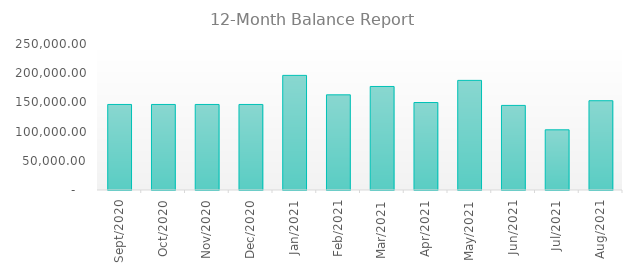
| Category | Value |
|---|---|
| 2020-09-30 | 146475 |
| 2020-10-31 | 146475 |
| 2020-11-30 | 146475 |
| 2020-12-31 | 146475 |
| 2021-01-31 | 196271.9 |
| 2021-02-28 | 162942.733 |
| 2021-03-31 | 177276.9 |
| 2021-04-30 | 149783.233 |
| 2021-05-31 | 187696.372 |
| 2021-06-30 | 144835.045 |
| 2021-07-31 | 103046.528 |
| 2021-08-31 | 152855.038 |